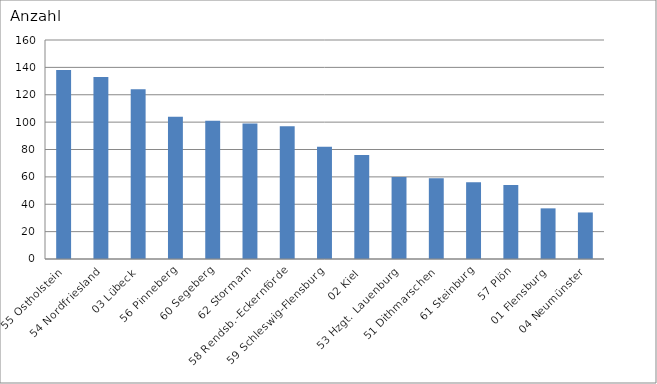
| Category | 55 Ostholstein 54 Nordfriesland 03 Lübeck 56 Pinneberg 60 Segeberg 62 Stormarn 58 Rendsb.-Eckernförde 59 Schleswig-Flensburg 02 Kiel 53 Hzgt. Lauenburg 51 Dithmarschen 61 Steinburg 57 Plön 01 Flensburg 04 Neumünster |
|---|---|
| 55 Ostholstein | 138 |
| 54 Nordfriesland | 133 |
| 03 Lübeck | 124 |
| 56 Pinneberg | 104 |
| 60 Segeberg | 101 |
| 62 Stormarn | 99 |
| 58 Rendsb.-Eckernförde | 97 |
| 59 Schleswig-Flensburg | 82 |
| 02 Kiel | 76 |
| 53 Hzgt. Lauenburg | 60 |
| 51 Dithmarschen | 59 |
| 61 Steinburg | 56 |
| 57 Plön | 54 |
| 01 Flensburg | 37 |
| 04 Neumünster | 34 |